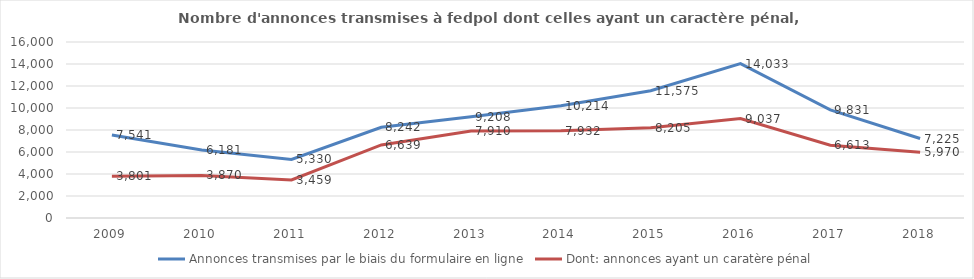
| Category | Annonces transmises par le biais du formulaire en ligne | Dont: annonces ayant un caratère pénal |
|---|---|---|
| 2009.0 | 7541 | 3801 |
| 2010.0 | 6181 | 3870 |
| 2011.0 | 5330 | 3459 |
| 2012.0 | 8242 | 6639 |
| 2013.0 | 9208 | 7910 |
| 2014.0 | 10214 | 7932 |
| 2015.0 | 11575 | 8205 |
| 2016.0 | 14033 | 9037 |
| 2017.0 | 9831 | 6613 |
| 2018.0 | 7225 | 5970 |